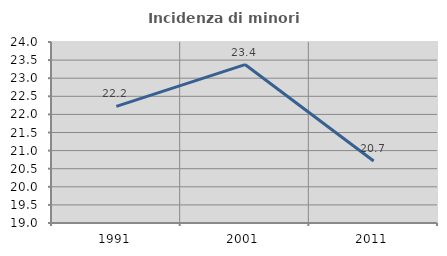
| Category | Incidenza di minori stranieri |
|---|---|
| 1991.0 | 22.222 |
| 2001.0 | 23.377 |
| 2011.0 | 20.712 |